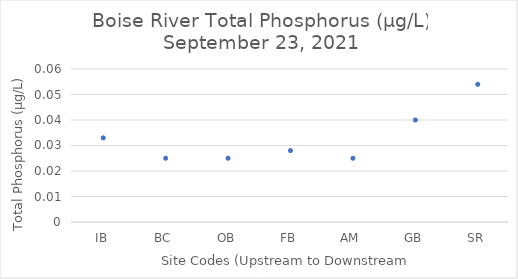
| Category | Series 0 |
|---|---|
| IB | 0.033 |
| BC | 0.025 |
| OB | 0.025 |
| FB | 0.028 |
| AM | 0.025 |
| GB | 0.04 |
| SR | 0.054 |